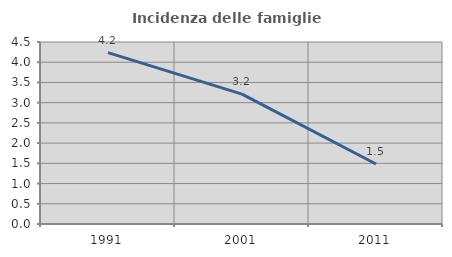
| Category | Incidenza delle famiglie numerose |
|---|---|
| 1991.0 | 4.239 |
| 2001.0 | 3.213 |
| 2011.0 | 1.485 |